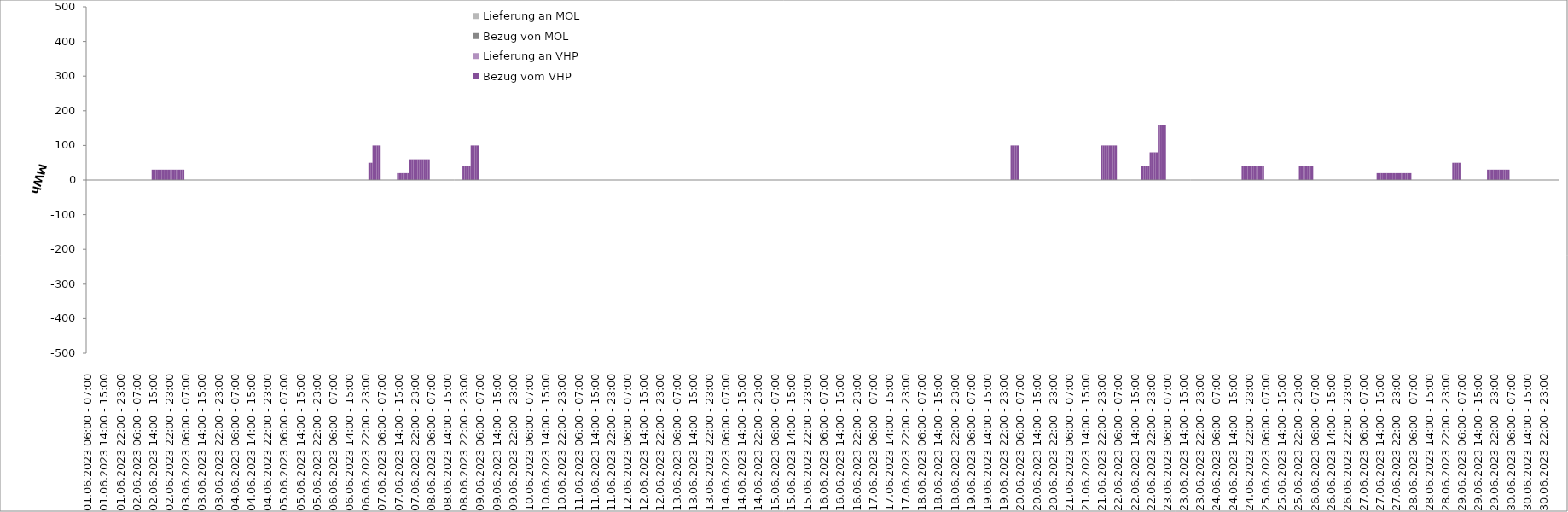
| Category | Bezug vom VHP | Lieferung an VHP | Bezug von MOL | Lieferung an MOL |
|---|---|---|---|---|
| 01.06.2023 06:00 - 07:00 | 0 | 0 | 0 | 0 |
| 01.06.2023 07:00 - 08:00 | 0 | 0 | 0 | 0 |
| 01.06.2023 08:00 - 09:00 | 0 | 0 | 0 | 0 |
| 01.06.2023 09:00 - 10:00 | 0 | 0 | 0 | 0 |
| 01.06.2023 10:00 - 11:00 | 0 | 0 | 0 | 0 |
| 01.06.2023 11:00 - 12:00 | 0 | 0 | 0 | 0 |
| 01.06.2023 12:00 - 13:00 | 0 | 0 | 0 | 0 |
| 01.06.2023 13:00 - 14:00 | 0 | 0 | 0 | 0 |
| 01.06.2023 14:00 - 15:00 | 0 | 0 | 0 | 0 |
| 01.06.2023 15:00 - 16:00 | 0 | 0 | 0 | 0 |
| 01.06.2023 16:00 - 17:00 | 0 | 0 | 0 | 0 |
| 01.06.2023 17:00 - 18:00 | 0 | 0 | 0 | 0 |
| 01.06.2023 18:00 - 19:00 | 0 | 0 | 0 | 0 |
| 01.06.2023 19:00 - 20:00 | 0 | 0 | 0 | 0 |
| 01.06.2023 20:00 - 21:00 | 0 | 0 | 0 | 0 |
| 01.06.2023 21:00 - 22:00 | 0 | 0 | 0 | 0 |
| 01.06.2023 22:00 - 23:00 | 0 | 0 | 0 | 0 |
| 01.06.2023 23:00 - 24:00 | 0 | 0 | 0 | 0 |
| 02.06.2023 00:00 - 01:00 | 0 | 0 | 0 | 0 |
| 02.06.2023 01:00 - 02:00 | 0 | 0 | 0 | 0 |
| 02.06.2023 02:00 - 03:00 | 0 | 0 | 0 | 0 |
| 02.06.2023 03:00 - 04:00 | 0 | 0 | 0 | 0 |
| 02.06.2023 04:00 - 05:00 | 0 | 0 | 0 | 0 |
| 02.06.2023 05:00 - 06:00 | 0 | 0 | 0 | 0 |
| 02.06.2023 06:00 - 07:00 | 0 | 0 | 0 | 0 |
| 02.06.2023 07:00 - 08:00 | 0 | 0 | 0 | 0 |
| 02.06.2023 08:00 - 09:00 | 0 | 0 | 0 | 0 |
| 02.06.2023 09:00 - 10:00 | 0 | 0 | 0 | 0 |
| 02.06.2023 10:00 - 11:00 | 0 | 0 | 0 | 0 |
| 02.06.2023 11:00 - 12:00 | 0 | 0 | 0 | 0 |
| 02.06.2023 12:00 - 13:00 | 0 | 0 | 0 | 0 |
| 02.06.2023 13:00 - 14:00 | 0 | 0 | 0 | 0 |
| 02.06.2023 14:00 - 15:00 | 30 | 0 | 0 | 0 |
| 02.06.2023 15:00 - 16:00 | 30 | 0 | 0 | 0 |
| 02.06.2023 16:00 - 17:00 | 30 | 0 | 0 | 0 |
| 02.06.2023 17:00 - 18:00 | 30 | 0 | 0 | 0 |
| 02.06.2023 18:00 - 19:00 | 30 | 0 | 0 | 0 |
| 02.06.2023 19:00 - 20:00 | 30 | 0 | 0 | 0 |
| 02.06.2023 20:00 - 21:00 | 30 | 0 | 0 | 0 |
| 02.06.2023 21:00 - 22:00 | 30 | 0 | 0 | 0 |
| 02.06.2023 22:00 - 23:00 | 30 | 0 | 0 | 0 |
| 02.06.2023 23:00 - 24:00 | 30 | 0 | 0 | 0 |
| 03.06.2023 00:00 - 01:00 | 30 | 0 | 0 | 0 |
| 03.06.2023 01:00 - 02:00 | 30 | 0 | 0 | 0 |
| 03.06.2023 02:00 - 03:00 | 30 | 0 | 0 | 0 |
| 03.06.2023 03:00 - 04:00 | 30 | 0 | 0 | 0 |
| 03.06.2023 04:00 - 05:00 | 30 | 0 | 0 | 0 |
| 03.06.2023 05:00 - 06:00 | 30 | 0 | 0 | 0 |
| 03.06.2023 06:00 - 07:00 | 0 | 0 | 0 | 0 |
| 03.06.2023 07:00 - 08:00 | 0 | 0 | 0 | 0 |
| 03.06.2023 08:00 - 09:00 | 0 | 0 | 0 | 0 |
| 03.06.2023 09:00 - 10:00 | 0 | 0 | 0 | 0 |
| 03.06.2023 10:00 - 11:00 | 0 | 0 | 0 | 0 |
| 03.06.2023 11:00 - 12:00 | 0 | 0 | 0 | 0 |
| 03.06.2023 12:00 - 13:00 | 0 | 0 | 0 | 0 |
| 03.06.2023 13:00 - 14:00 | 0 | 0 | 0 | 0 |
| 03.06.2023 14:00 - 15:00 | 0 | 0 | 0 | 0 |
| 03.06.2023 15:00 - 16:00 | 0 | 0 | 0 | 0 |
| 03.06.2023 16:00 - 17:00 | 0 | 0 | 0 | 0 |
| 03.06.2023 17:00 - 18:00 | 0 | 0 | 0 | 0 |
| 03.06.2023 18:00 - 19:00 | 0 | 0 | 0 | 0 |
| 03.06.2023 19:00 - 20:00 | 0 | 0 | 0 | 0 |
| 03.06.2023 20:00 - 21:00 | 0 | 0 | 0 | 0 |
| 03.06.2023 21:00 - 22:00 | 0 | 0 | 0 | 0 |
| 03.06.2023 22:00 - 23:00 | 0 | 0 | 0 | 0 |
| 03.06.2023 23:00 - 24:00 | 0 | 0 | 0 | 0 |
| 04.06.2023 00:00 - 01:00 | 0 | 0 | 0 | 0 |
| 04.06.2023 01:00 - 02:00 | 0 | 0 | 0 | 0 |
| 04.06.2023 02:00 - 03:00 | 0 | 0 | 0 | 0 |
| 04.06.2023 03:00 - 04:00 | 0 | 0 | 0 | 0 |
| 04.06.2023 04:00 - 05:00 | 0 | 0 | 0 | 0 |
| 04.06.2023 05:00 - 06:00 | 0 | 0 | 0 | 0 |
| 04.06.2023 06:00 - 07:00 | 0 | 0 | 0 | 0 |
| 04.06.2023 07:00 - 08:00 | 0 | 0 | 0 | 0 |
| 04.06.2023 08:00 - 09:00 | 0 | 0 | 0 | 0 |
| 04.06.2023 09:00 - 10:00 | 0 | 0 | 0 | 0 |
| 04.06.2023 10:00 - 11:00 | 0 | 0 | 0 | 0 |
| 04.06.2023 11:00 - 12:00 | 0 | 0 | 0 | 0 |
| 04.06.2023 12:00 - 13:00 | 0 | 0 | 0 | 0 |
| 04.06.2023 13:00 - 14:00 | 0 | 0 | 0 | 0 |
| 04.06.2023 14:00 - 15:00 | 0 | 0 | 0 | 0 |
| 04.06.2023 15:00 - 16:00 | 0 | 0 | 0 | 0 |
| 04.06.2023 16:00 - 17:00 | 0 | 0 | 0 | 0 |
| 04.06.2023 17:00 - 18:00 | 0 | 0 | 0 | 0 |
| 04.06.2023 18:00 - 19:00 | 0 | 0 | 0 | 0 |
| 04.06.2023 19:00 - 20:00 | 0 | 0 | 0 | 0 |
| 04.06.2023 20:00 - 21:00 | 0 | 0 | 0 | 0 |
| 04.06.2023 21:00 - 22:00 | 0 | 0 | 0 | 0 |
| 04.06.2023 22:00 - 23:00 | 0 | 0 | 0 | 0 |
| 04.06.2023 23:00 - 24:00 | 0 | 0 | 0 | 0 |
| 05.06.2023 00:00 - 01:00 | 0 | 0 | 0 | 0 |
| 05.06.2023 01:00 - 02:00 | 0 | 0 | 0 | 0 |
| 05.06.2023 02:00 - 03:00 | 0 | 0 | 0 | 0 |
| 05.06.2023 03:00 - 04:00 | 0 | 0 | 0 | 0 |
| 05.06.2023 04:00 - 05:00 | 0 | 0 | 0 | 0 |
| 05.06.2023 05:00 - 06:00 | 0 | 0 | 0 | 0 |
| 05.06.2023 06:00 - 07:00 | 0 | 0 | 0 | 0 |
| 05.06.2023 07:00 - 08:00 | 0 | 0 | 0 | 0 |
| 05.06.2023 08:00 - 09:00 | 0 | 0 | 0 | 0 |
| 05.06.2023 09:00 - 10:00 | 0 | 0 | 0 | 0 |
| 05.06.2023 10:00 - 11:00 | 0 | 0 | 0 | 0 |
| 05.06.2023 11:00 - 12:00 | 0 | 0 | 0 | 0 |
| 05.06.2023 12:00 - 13:00 | 0 | 0 | 0 | 0 |
| 05.06.2023 13:00 - 14:00 | 0 | 0 | 0 | 0 |
| 05.06.2023 14:00 - 15:00 | 0 | 0 | 0 | 0 |
| 05.06.2023 15:00 - 16:00 | 0 | 0 | 0 | 0 |
| 05.06.2023 16:00 - 17:00 | 0 | 0 | 0 | 0 |
| 05.06.2023 17:00 - 18:00 | 0 | 0 | 0 | 0 |
| 05.06.2023 18:00 - 19:00 | 0 | 0 | 0 | 0 |
| 05.06.2023 19:00 - 20:00 | 0 | 0 | 0 | 0 |
| 05.06.2023 20:00 - 21:00 | 0 | 0 | 0 | 0 |
| 05.06.2023 21:00 - 22:00 | 0 | 0 | 0 | 0 |
| 05.06.2023 22:00 - 23:00 | 0 | 0 | 0 | 0 |
| 05.06.2023 23:00 - 24:00 | 0 | 0 | 0 | 0 |
| 06.06.2023 00:00 - 01:00 | 0 | 0 | 0 | 0 |
| 06.06.2023 01:00 - 02:00 | 0 | 0 | 0 | 0 |
| 06.06.2023 02:00 - 03:00 | 0 | 0 | 0 | 0 |
| 06.06.2023 03:00 - 04:00 | 0 | 0 | 0 | 0 |
| 06.06.2023 04:00 - 05:00 | 0 | 0 | 0 | 0 |
| 06.06.2023 05:00 - 06:00 | 0 | 0 | 0 | 0 |
| 06.06.2023 06:00 - 07:00 | 0 | 0 | 0 | 0 |
| 06.06.2023 07:00 - 08:00 | 0 | 0 | 0 | 0 |
| 06.06.2023 08:00 - 09:00 | 0 | 0 | 0 | 0 |
| 06.06.2023 09:00 - 10:00 | 0 | 0 | 0 | 0 |
| 06.06.2023 10:00 - 11:00 | 0 | 0 | 0 | 0 |
| 06.06.2023 11:00 - 12:00 | 0 | 0 | 0 | 0 |
| 06.06.2023 12:00 - 13:00 | 0 | 0 | 0 | 0 |
| 06.06.2023 13:00 - 14:00 | 0 | 0 | 0 | 0 |
| 06.06.2023 14:00 - 15:00 | 0 | 0 | 0 | 0 |
| 06.06.2023 15:00 - 16:00 | 0 | 0 | 0 | 0 |
| 06.06.2023 16:00 - 17:00 | 0 | 0 | 0 | 0 |
| 06.06.2023 17:00 - 18:00 | 0 | 0 | 0 | 0 |
| 06.06.2023 18:00 - 19:00 | 0 | 0 | 0 | 0 |
| 06.06.2023 19:00 - 20:00 | 0 | 0 | 0 | 0 |
| 06.06.2023 20:00 - 21:00 | 0 | 0 | 0 | 0 |
| 06.06.2023 21:00 - 22:00 | 0 | 0 | 0 | 0 |
| 06.06.2023 22:00 - 23:00 | 0 | 0 | 0 | 0 |
| 06.06.2023 23:00 - 24:00 | 0 | 0 | 0 | 0 |
| 07.06.2023 00:00 - 01:00 | 50 | 0 | 0 | 0 |
| 07.06.2023 01:00 - 02:00 | 50 | 0 | 0 | 0 |
| 07.06.2023 02:00 - 03:00 | 100 | 0 | 0 | 0 |
| 07.06.2023 03:00 - 04:00 | 100 | 0 | 0 | 0 |
| 07.06.2023 04:00 - 05:00 | 100 | 0 | 0 | 0 |
| 07.06.2023 05:00 - 06:00 | 100 | 0 | 0 | 0 |
| 07.06.2023 06:00 - 07:00 | 0 | 0 | 0 | 0 |
| 07.06.2023 07:00 - 08:00 | 0 | 0 | 0 | 0 |
| 07.06.2023 08:00 - 09:00 | 0 | 0 | 0 | 0 |
| 07.06.2023 09:00 - 10:00 | 0 | 0 | 0 | 0 |
| 07.06.2023 10:00 - 11:00 | 0 | 0 | 0 | 0 |
| 07.06.2023 11:00 - 12:00 | 0 | 0 | 0 | 0 |
| 07.06.2023 12:00 - 13:00 | 0 | 0 | 0 | 0 |
| 07.06.2023 13:00 - 14:00 | 0 | 0 | 0 | 0 |
| 07.06.2023 14:00 - 15:00 | 20 | 0 | 0 | 0 |
| 07.06.2023 15:00 - 16:00 | 20 | 0 | 0 | 0 |
| 07.06.2023 16:00 - 17:00 | 20 | 0 | 0 | 0 |
| 07.06.2023 17:00 - 18:00 | 20 | 0 | 0 | 0 |
| 07.06.2023 18:00 - 19:00 | 20 | 0 | 0 | 0 |
| 07.06.2023 19:00 - 20:00 | 20 | 0 | 0 | 0 |
| 07.06.2023 20:00 - 21:00 | 60 | 0 | 0 | 0 |
| 07.06.2023 21:00 - 22:00 | 60 | 0 | 0 | 0 |
| 07.06.2023 22:00 - 23:00 | 60 | 0 | 0 | 0 |
| 07.06.2023 23:00 - 24:00 | 60 | 0 | 0 | 0 |
| 08.06.2023 00:00 - 01:00 | 60 | 0 | 0 | 0 |
| 08.06.2023 01:00 - 02:00 | 60 | 0 | 0 | 0 |
| 08.06.2023 02:00 - 03:00 | 60 | 0 | 0 | 0 |
| 08.06.2023 03:00 - 04:00 | 60 | 0 | 0 | 0 |
| 08.06.2023 04:00 - 05:00 | 60 | 0 | 0 | 0 |
| 08.06.2023 05:00 - 06:00 | 60 | 0 | 0 | 0 |
| 08.06.2023 06:00 - 07:00 | 0 | 0 | 0 | 0 |
| 08.06.2023 07:00 - 08:00 | 0 | 0 | 0 | 0 |
| 08.06.2023 08:00 - 09:00 | 0 | 0 | 0 | 0 |
| 08.06.2023 09:00 - 10:00 | 0 | 0 | 0 | 0 |
| 08.06.2023 10:00 - 11:00 | 0 | 0 | 0 | 0 |
| 08.06.2023 11:00 - 12:00 | 0 | 0 | 0 | 0 |
| 08.06.2023 12:00 - 13:00 | 0 | 0 | 0 | 0 |
| 08.06.2023 13:00 - 14:00 | 0 | 0 | 0 | 0 |
| 08.06.2023 14:00 - 15:00 | 0 | 0 | 0 | 0 |
| 08.06.2023 15:00 - 16:00 | 0 | 0 | 0 | 0 |
| 08.06.2023 16:00 - 17:00 | 0 | 0 | 0 | 0 |
| 08.06.2023 17:00 - 18:00 | 0 | 0 | 0 | 0 |
| 08.06.2023 18:00 - 19:00 | 0 | 0 | 0 | 0 |
| 08.06.2023 19:00 - 20:00 | 0 | 0 | 0 | 0 |
| 08.06.2023 20:00 - 21:00 | 0 | 0 | 0 | 0 |
| 08.06.2023 21:00 - 22:00 | 0 | 0 | 0 | 0 |
| 08.06.2023 22:00 - 23:00 | 40 | 0 | 0 | 0 |
| 08.06.2023 23:00 - 24:00 | 40 | 0 | 0 | 0 |
| 09.06.2023 00:00 - 01:00 | 40 | 0 | 0 | 0 |
| 09.06.2023 01:00 - 02:00 | 40 | 0 | 0 | 0 |
| 09.06.2023 02:00 - 03:00 | 100 | 0 | 0 | 0 |
| 09.06.2023 03:00 - 04:00 | 100 | 0 | 0 | 0 |
| 09.06.2023 04:00 - 05:00 | 100 | 0 | 0 | 0 |
| 09.06.2023 05:00 - 06:00 | 100 | 0 | 0 | 0 |
| 09.06.2023 06:00 - 07:00 | 0 | 0 | 0 | 0 |
| 09.06.2023 07:00 - 08:00 | 0 | 0 | 0 | 0 |
| 09.06.2023 08:00 - 09:00 | 0 | 0 | 0 | 0 |
| 09.06.2023 09:00 - 10:00 | 0 | 0 | 0 | 0 |
| 09.06.2023 10:00 - 11:00 | 0 | 0 | 0 | 0 |
| 09.06.2023 11:00 - 12:00 | 0 | 0 | 0 | 0 |
| 09.06.2023 12:00 - 13:00 | 0 | 0 | 0 | 0 |
| 09.06.2023 13:00 - 14:00 | 0 | 0 | 0 | 0 |
| 09.06.2023 14:00 - 15:00 | 0 | 0 | 0 | 0 |
| 09.06.2023 15:00 - 16:00 | 0 | 0 | 0 | 0 |
| 09.06.2023 16:00 - 17:00 | 0 | 0 | 0 | 0 |
| 09.06.2023 17:00 - 18:00 | 0 | 0 | 0 | 0 |
| 09.06.2023 18:00 - 19:00 | 0 | 0 | 0 | 0 |
| 09.06.2023 19:00 - 20:00 | 0 | 0 | 0 | 0 |
| 09.06.2023 20:00 - 21:00 | 0 | 0 | 0 | 0 |
| 09.06.2023 21:00 - 22:00 | 0 | 0 | 0 | 0 |
| 09.06.2023 22:00 - 23:00 | 0 | 0 | 0 | 0 |
| 09.06.2023 23:00 - 24:00 | 0 | 0 | 0 | 0 |
| 10.06.2023 00:00 - 01:00 | 0 | 0 | 0 | 0 |
| 10.06.2023 01:00 - 02:00 | 0 | 0 | 0 | 0 |
| 10.06.2023 02:00 - 03:00 | 0 | 0 | 0 | 0 |
| 10.06.2023 03:00 - 04:00 | 0 | 0 | 0 | 0 |
| 10.06.2023 04:00 - 05:00 | 0 | 0 | 0 | 0 |
| 10.06.2023 05:00 - 06:00 | 0 | 0 | 0 | 0 |
| 10.06.2023 06:00 - 07:00 | 0 | 0 | 0 | 0 |
| 10.06.2023 07:00 - 08:00 | 0 | 0 | 0 | 0 |
| 10.06.2023 08:00 - 09:00 | 0 | 0 | 0 | 0 |
| 10.06.2023 09:00 - 10:00 | 0 | 0 | 0 | 0 |
| 10.06.2023 10:00 - 11:00 | 0 | 0 | 0 | 0 |
| 10.06.2023 11:00 - 12:00 | 0 | 0 | 0 | 0 |
| 10.06.2023 12:00 - 13:00 | 0 | 0 | 0 | 0 |
| 10.06.2023 13:00 - 14:00 | 0 | 0 | 0 | 0 |
| 10.06.2023 14:00 - 15:00 | 0 | 0 | 0 | 0 |
| 10.06.2023 15:00 - 16:00 | 0 | 0 | 0 | 0 |
| 10.06.2023 16:00 - 17:00 | 0 | 0 | 0 | 0 |
| 10.06.2023 17:00 - 18:00 | 0 | 0 | 0 | 0 |
| 10.06.2023 18:00 - 19:00 | 0 | 0 | 0 | 0 |
| 10.06.2023 19:00 - 20:00 | 0 | 0 | 0 | 0 |
| 10.06.2023 20:00 - 21:00 | 0 | 0 | 0 | 0 |
| 10.06.2023 21:00 - 22:00 | 0 | 0 | 0 | 0 |
| 10.06.2023 22:00 - 23:00 | 0 | 0 | 0 | 0 |
| 10.06.2023 23:00 - 24:00 | 0 | 0 | 0 | 0 |
| 11.06.2023 00:00 - 01:00 | 0 | 0 | 0 | 0 |
| 11.06.2023 01:00 - 02:00 | 0 | 0 | 0 | 0 |
| 11.06.2023 02:00 - 03:00 | 0 | 0 | 0 | 0 |
| 11.06.2023 03:00 - 04:00 | 0 | 0 | 0 | 0 |
| 11.06.2023 04:00 - 05:00 | 0 | 0 | 0 | 0 |
| 11.06.2023 05:00 - 06:00 | 0 | 0 | 0 | 0 |
| 11.06.2023 06:00 - 07:00 | 0 | 0 | 0 | 0 |
| 11.06.2023 07:00 - 08:00 | 0 | 0 | 0 | 0 |
| 11.06.2023 08:00 - 09:00 | 0 | 0 | 0 | 0 |
| 11.06.2023 09:00 - 10:00 | 0 | 0 | 0 | 0 |
| 11.06.2023 10:00 - 11:00 | 0 | 0 | 0 | 0 |
| 11.06.2023 11:00 - 12:00 | 0 | 0 | 0 | 0 |
| 11.06.2023 12:00 - 13:00 | 0 | 0 | 0 | 0 |
| 11.06.2023 13:00 - 14:00 | 0 | 0 | 0 | 0 |
| 11.06.2023 14:00 - 15:00 | 0 | 0 | 0 | 0 |
| 11.06.2023 15:00 - 16:00 | 0 | 0 | 0 | 0 |
| 11.06.2023 16:00 - 17:00 | 0 | 0 | 0 | 0 |
| 11.06.2023 17:00 - 18:00 | 0 | 0 | 0 | 0 |
| 11.06.2023 18:00 - 19:00 | 0 | 0 | 0 | 0 |
| 11.06.2023 19:00 - 20:00 | 0 | 0 | 0 | 0 |
| 11.06.2023 20:00 - 21:00 | 0 | 0 | 0 | 0 |
| 11.06.2023 21:00 - 22:00 | 0 | 0 | 0 | 0 |
| 11.06.2023 22:00 - 23:00 | 0 | 0 | 0 | 0 |
| 11.06.2023 23:00 - 24:00 | 0 | 0 | 0 | 0 |
| 12.06.2023 00:00 - 01:00 | 0 | 0 | 0 | 0 |
| 12.06.2023 01:00 - 02:00 | 0 | 0 | 0 | 0 |
| 12.06.2023 02:00 - 03:00 | 0 | 0 | 0 | 0 |
| 12.06.2023 03:00 - 04:00 | 0 | 0 | 0 | 0 |
| 12.06.2023 04:00 - 05:00 | 0 | 0 | 0 | 0 |
| 12.06.2023 05:00 - 06:00 | 0 | 0 | 0 | 0 |
| 12.06.2023 06:00 - 07:00 | 0 | 0 | 0 | 0 |
| 12.06.2023 07:00 - 08:00 | 0 | 0 | 0 | 0 |
| 12.06.2023 08:00 - 09:00 | 0 | 0 | 0 | 0 |
| 12.06.2023 09:00 - 10:00 | 0 | 0 | 0 | 0 |
| 12.06.2023 10:00 - 11:00 | 0 | 0 | 0 | 0 |
| 12.06.2023 11:00 - 12:00 | 0 | 0 | 0 | 0 |
| 12.06.2023 12:00 - 13:00 | 0 | 0 | 0 | 0 |
| 12.06.2023 13:00 - 14:00 | 0 | 0 | 0 | 0 |
| 12.06.2023 14:00 - 15:00 | 0 | 0 | 0 | 0 |
| 12.06.2023 15:00 - 16:00 | 0 | 0 | 0 | 0 |
| 12.06.2023 16:00 - 17:00 | 0 | 0 | 0 | 0 |
| 12.06.2023 17:00 - 18:00 | 0 | 0 | 0 | 0 |
| 12.06.2023 18:00 - 19:00 | 0 | 0 | 0 | 0 |
| 12.06.2023 19:00 - 20:00 | 0 | 0 | 0 | 0 |
| 12.06.2023 20:00 - 21:00 | 0 | 0 | 0 | 0 |
| 12.06.2023 21:00 - 22:00 | 0 | 0 | 0 | 0 |
| 12.06.2023 22:00 - 23:00 | 0 | 0 | 0 | 0 |
| 12.06.2023 23:00 - 24:00 | 0 | 0 | 0 | 0 |
| 13.06.2023 00:00 - 01:00 | 0 | 0 | 0 | 0 |
| 13.06.2023 01:00 - 02:00 | 0 | 0 | 0 | 0 |
| 13.06.2023 02:00 - 03:00 | 0 | 0 | 0 | 0 |
| 13.06.2023 03:00 - 04:00 | 0 | 0 | 0 | 0 |
| 13.06.2023 04:00 - 05:00 | 0 | 0 | 0 | 0 |
| 13.06.2023 05:00 - 06:00 | 0 | 0 | 0 | 0 |
| 13.06.2023 06:00 - 07:00 | 0 | 0 | 0 | 0 |
| 13.06.2023 07:00 - 08:00 | 0 | 0 | 0 | 0 |
| 13.06.2023 08:00 - 09:00 | 0 | 0 | 0 | 0 |
| 13.06.2023 09:00 - 10:00 | 0 | 0 | 0 | 0 |
| 13.06.2023 10:00 - 11:00 | 0 | 0 | 0 | 0 |
| 13.06.2023 11:00 - 12:00 | 0 | 0 | 0 | 0 |
| 13.06.2023 12:00 - 13:00 | 0 | 0 | 0 | 0 |
| 13.06.2023 13:00 - 14:00 | 0 | 0 | 0 | 0 |
| 13.06.2023 14:00 - 15:00 | 0 | 0 | 0 | 0 |
| 13.06.2023 15:00 - 16:00 | 0 | 0 | 0 | 0 |
| 13.06.2023 16:00 - 17:00 | 0 | 0 | 0 | 0 |
| 13.06.2023 17:00 - 18:00 | 0 | 0 | 0 | 0 |
| 13.06.2023 18:00 - 19:00 | 0 | 0 | 0 | 0 |
| 13.06.2023 19:00 - 20:00 | 0 | 0 | 0 | 0 |
| 13.06.2023 20:00 - 21:00 | 0 | 0 | 0 | 0 |
| 13.06.2023 21:00 - 22:00 | 0 | 0 | 0 | 0 |
| 13.06.2023 22:00 - 23:00 | 0 | 0 | 0 | 0 |
| 13.06.2023 23:00 - 24:00 | 0 | 0 | 0 | 0 |
| 14.06.2023 00:00 - 01:00 | 0 | 0 | 0 | 0 |
| 14.06.2023 01:00 - 02:00 | 0 | 0 | 0 | 0 |
| 14.06.2023 02:00 - 03:00 | 0 | 0 | 0 | 0 |
| 14.06.2023 03:00 - 04:00 | 0 | 0 | 0 | 0 |
| 14.06.2023 04:00 - 05:00 | 0 | 0 | 0 | 0 |
| 14.06.2023 05:00 - 06:00 | 0 | 0 | 0 | 0 |
| 14.06.2023 06:00 - 07:00 | 0 | 0 | 0 | 0 |
| 14.06.2023 07:00 - 08:00 | 0 | 0 | 0 | 0 |
| 14.06.2023 08:00 - 09:00 | 0 | 0 | 0 | 0 |
| 14.06.2023 09:00 - 10:00 | 0 | 0 | 0 | 0 |
| 14.06.2023 10:00 - 11:00 | 0 | 0 | 0 | 0 |
| 14.06.2023 11:00 - 12:00 | 0 | 0 | 0 | 0 |
| 14.06.2023 12:00 - 13:00 | 0 | 0 | 0 | 0 |
| 14.06.2023 13:00 - 14:00 | 0 | 0 | 0 | 0 |
| 14.06.2023 14:00 - 15:00 | 0 | 0 | 0 | 0 |
| 14.06.2023 15:00 - 16:00 | 0 | 0 | 0 | 0 |
| 14.06.2023 16:00 - 17:00 | 0 | 0 | 0 | 0 |
| 14.06.2023 17:00 - 18:00 | 0 | 0 | 0 | 0 |
| 14.06.2023 18:00 - 19:00 | 0 | 0 | 0 | 0 |
| 14.06.2023 19:00 - 20:00 | 0 | 0 | 0 | 0 |
| 14.06.2023 20:00 - 21:00 | 0 | 0 | 0 | 0 |
| 14.06.2023 21:00 - 22:00 | 0 | 0 | 0 | 0 |
| 14.06.2023 22:00 - 23:00 | 0 | 0 | 0 | 0 |
| 14.06.2023 23:00 - 24:00 | 0 | 0 | 0 | 0 |
| 15.06.2023 00:00 - 01:00 | 0 | 0 | 0 | 0 |
| 15.06.2023 01:00 - 02:00 | 0 | 0 | 0 | 0 |
| 15.06.2023 02:00 - 03:00 | 0 | 0 | 0 | 0 |
| 15.06.2023 03:00 - 04:00 | 0 | 0 | 0 | 0 |
| 15.06.2023 04:00 - 05:00 | 0 | 0 | 0 | 0 |
| 15.06.2023 05:00 - 06:00 | 0 | 0 | 0 | 0 |
| 15.06.2023 06:00 - 07:00 | 0 | 0 | 0 | 0 |
| 15.06.2023 07:00 - 08:00 | 0 | 0 | 0 | 0 |
| 15.06.2023 08:00 - 09:00 | 0 | 0 | 0 | 0 |
| 15.06.2023 09:00 - 10:00 | 0 | 0 | 0 | 0 |
| 15.06.2023 10:00 - 11:00 | 0 | 0 | 0 | 0 |
| 15.06.2023 11:00 - 12:00 | 0 | 0 | 0 | 0 |
| 15.06.2023 12:00 - 13:00 | 0 | 0 | 0 | 0 |
| 15.06.2023 13:00 - 14:00 | 0 | 0 | 0 | 0 |
| 15.06.2023 14:00 - 15:00 | 0 | 0 | 0 | 0 |
| 15.06.2023 15:00 - 16:00 | 0 | 0 | 0 | 0 |
| 15.06.2023 16:00 - 17:00 | 0 | 0 | 0 | 0 |
| 15.06.2023 17:00 - 18:00 | 0 | 0 | 0 | 0 |
| 15.06.2023 18:00 - 19:00 | 0 | 0 | 0 | 0 |
| 15.06.2023 19:00 - 20:00 | 0 | 0 | 0 | 0 |
| 15.06.2023 20:00 - 21:00 | 0 | 0 | 0 | 0 |
| 15.06.2023 21:00 - 22:00 | 0 | 0 | 0 | 0 |
| 15.06.2023 22:00 - 23:00 | 0 | 0 | 0 | 0 |
| 15.06.2023 23:00 - 24:00 | 0 | 0 | 0 | 0 |
| 16.06.2023 00:00 - 01:00 | 0 | 0 | 0 | 0 |
| 16.06.2023 01:00 - 02:00 | 0 | 0 | 0 | 0 |
| 16.06.2023 02:00 - 03:00 | 0 | 0 | 0 | 0 |
| 16.06.2023 03:00 - 04:00 | 0 | 0 | 0 | 0 |
| 16.06.2023 04:00 - 05:00 | 0 | 0 | 0 | 0 |
| 16.06.2023 05:00 - 06:00 | 0 | 0 | 0 | 0 |
| 16.06.2023 06:00 - 07:00 | 0 | 0 | 0 | 0 |
| 16.06.2023 07:00 - 08:00 | 0 | 0 | 0 | 0 |
| 16.06.2023 08:00 - 09:00 | 0 | 0 | 0 | 0 |
| 16.06.2023 09:00 - 10:00 | 0 | 0 | 0 | 0 |
| 16.06.2023 10:00 - 11:00 | 0 | 0 | 0 | 0 |
| 16.06.2023 11:00 - 12:00 | 0 | 0 | 0 | 0 |
| 16.06.2023 12:00 - 13:00 | 0 | 0 | 0 | 0 |
| 16.06.2023 13:00 - 14:00 | 0 | 0 | 0 | 0 |
| 16.06.2023 14:00 - 15:00 | 0 | 0 | 0 | 0 |
| 16.06.2023 15:00 - 16:00 | 0 | 0 | 0 | 0 |
| 16.06.2023 16:00 - 17:00 | 0 | 0 | 0 | 0 |
| 16.06.2023 17:00 - 18:00 | 0 | 0 | 0 | 0 |
| 16.06.2023 18:00 - 19:00 | 0 | 0 | 0 | 0 |
| 16.06.2023 19:00 - 20:00 | 0 | 0 | 0 | 0 |
| 16.06.2023 20:00 - 21:00 | 0 | 0 | 0 | 0 |
| 16.06.2023 21:00 - 22:00 | 0 | 0 | 0 | 0 |
| 16.06.2023 22:00 - 23:00 | 0 | 0 | 0 | 0 |
| 16.06.2023 23:00 - 24:00 | 0 | 0 | 0 | 0 |
| 17.06.2023 00:00 - 01:00 | 0 | 0 | 0 | 0 |
| 17.06.2023 01:00 - 02:00 | 0 | 0 | 0 | 0 |
| 17.06.2023 02:00 - 03:00 | 0 | 0 | 0 | 0 |
| 17.06.2023 03:00 - 04:00 | 0 | 0 | 0 | 0 |
| 17.06.2023 04:00 - 05:00 | 0 | 0 | 0 | 0 |
| 17.06.2023 05:00 - 06:00 | 0 | 0 | 0 | 0 |
| 17.06.2023 06:00 - 07:00 | 0 | 0 | 0 | 0 |
| 17.06.2023 07:00 - 08:00 | 0 | 0 | 0 | 0 |
| 17.06.2023 08:00 - 09:00 | 0 | 0 | 0 | 0 |
| 17.06.2023 09:00 - 10:00 | 0 | 0 | 0 | 0 |
| 17.06.2023 10:00 - 11:00 | 0 | 0 | 0 | 0 |
| 17.06.2023 11:00 - 12:00 | 0 | 0 | 0 | 0 |
| 17.06.2023 12:00 - 13:00 | 0 | 0 | 0 | 0 |
| 17.06.2023 13:00 - 14:00 | 0 | 0 | 0 | 0 |
| 17.06.2023 14:00 - 15:00 | 0 | 0 | 0 | 0 |
| 17.06.2023 15:00 - 16:00 | 0 | 0 | 0 | 0 |
| 17.06.2023 16:00 - 17:00 | 0 | 0 | 0 | 0 |
| 17.06.2023 17:00 - 18:00 | 0 | 0 | 0 | 0 |
| 17.06.2023 18:00 - 19:00 | 0 | 0 | 0 | 0 |
| 17.06.2023 19:00 - 20:00 | 0 | 0 | 0 | 0 |
| 17.06.2023 20:00 - 21:00 | 0 | 0 | 0 | 0 |
| 17.06.2023 21:00 - 22:00 | 0 | 0 | 0 | 0 |
| 17.06.2023 22:00 - 23:00 | 0 | 0 | 0 | 0 |
| 17.06.2023 23:00 - 24:00 | 0 | 0 | 0 | 0 |
| 18.06.2023 00:00 - 01:00 | 0 | 0 | 0 | 0 |
| 18.06.2023 01:00 - 02:00 | 0 | 0 | 0 | 0 |
| 18.06.2023 02:00 - 03:00 | 0 | 0 | 0 | 0 |
| 18.06.2023 03:00 - 04:00 | 0 | 0 | 0 | 0 |
| 18.06.2023 04:00 - 05:00 | 0 | 0 | 0 | 0 |
| 18.06.2023 05:00 - 06:00 | 0 | 0 | 0 | 0 |
| 18.06.2023 06:00 - 07:00 | 0 | 0 | 0 | 0 |
| 18.06.2023 07:00 - 08:00 | 0 | 0 | 0 | 0 |
| 18.06.2023 08:00 - 09:00 | 0 | 0 | 0 | 0 |
| 18.06.2023 09:00 - 10:00 | 0 | 0 | 0 | 0 |
| 18.06.2023 10:00 - 11:00 | 0 | 0 | 0 | 0 |
| 18.06.2023 11:00 - 12:00 | 0 | 0 | 0 | 0 |
| 18.06.2023 12:00 - 13:00 | 0 | 0 | 0 | 0 |
| 18.06.2023 13:00 - 14:00 | 0 | 0 | 0 | 0 |
| 18.06.2023 14:00 - 15:00 | 0 | 0 | 0 | 0 |
| 18.06.2023 15:00 - 16:00 | 0 | 0 | 0 | 0 |
| 18.06.2023 16:00 - 17:00 | 0 | 0 | 0 | 0 |
| 18.06.2023 17:00 - 18:00 | 0 | 0 | 0 | 0 |
| 18.06.2023 18:00 - 19:00 | 0 | 0 | 0 | 0 |
| 18.06.2023 19:00 - 20:00 | 0 | 0 | 0 | 0 |
| 18.06.2023 20:00 - 21:00 | 0 | 0 | 0 | 0 |
| 18.06.2023 21:00 - 22:00 | 0 | 0 | 0 | 0 |
| 18.06.2023 22:00 - 23:00 | 0 | 0 | 0 | 0 |
| 18.06.2023 23:00 - 24:00 | 0 | 0 | 0 | 0 |
| 19.06.2023 00:00 - 01:00 | 0 | 0 | 0 | 0 |
| 19.06.2023 01:00 - 02:00 | 0 | 0 | 0 | 0 |
| 19.06.2023 02:00 - 03:00 | 0 | 0 | 0 | 0 |
| 19.06.2023 03:00 - 04:00 | 0 | 0 | 0 | 0 |
| 19.06.2023 04:00 - 05:00 | 0 | 0 | 0 | 0 |
| 19.06.2023 05:00 - 06:00 | 0 | 0 | 0 | 0 |
| 19.06.2023 06:00 - 07:00 | 0 | 0 | 0 | 0 |
| 19.06.2023 07:00 - 08:00 | 0 | 0 | 0 | 0 |
| 19.06.2023 08:00 - 09:00 | 0 | 0 | 0 | 0 |
| 19.06.2023 09:00 - 10:00 | 0 | 0 | 0 | 0 |
| 19.06.2023 10:00 - 11:00 | 0 | 0 | 0 | 0 |
| 19.06.2023 11:00 - 12:00 | 0 | 0 | 0 | 0 |
| 19.06.2023 12:00 - 13:00 | 0 | 0 | 0 | 0 |
| 19.06.2023 13:00 - 14:00 | 0 | 0 | 0 | 0 |
| 19.06.2023 14:00 - 15:00 | 0 | 0 | 0 | 0 |
| 19.06.2023 15:00 - 16:00 | 0 | 0 | 0 | 0 |
| 19.06.2023 16:00 - 17:00 | 0 | 0 | 0 | 0 |
| 19.06.2023 17:00 - 18:00 | 0 | 0 | 0 | 0 |
| 19.06.2023 18:00 - 19:00 | 0 | 0 | 0 | 0 |
| 19.06.2023 19:00 - 20:00 | 0 | 0 | 0 | 0 |
| 19.06.2023 20:00 - 21:00 | 0 | 0 | 0 | 0 |
| 19.06.2023 21:00 - 22:00 | 0 | 0 | 0 | 0 |
| 19.06.2023 22:00 - 23:00 | 0 | 0 | 0 | 0 |
| 19.06.2023 23:00 - 24:00 | 0 | 0 | 0 | 0 |
| 20.06.2023 00:00 - 01:00 | 0 | 0 | 0 | 0 |
| 20.06.2023 01:00 - 02:00 | 0 | 0 | 0 | 0 |
| 20.06.2023 02:00 - 03:00 | 100 | 0 | 0 | 0 |
| 20.06.2023 03:00 - 04:00 | 100 | 0 | 0 | 0 |
| 20.06.2023 04:00 - 05:00 | 100 | 0 | 0 | 0 |
| 20.06.2023 05:00 - 06:00 | 100 | 0 | 0 | 0 |
| 20.06.2023 06:00 - 07:00 | 0 | 0 | 0 | 0 |
| 20.06.2023 07:00 - 08:00 | 0 | 0 | 0 | 0 |
| 20.06.2023 08:00 - 09:00 | 0 | 0 | 0 | 0 |
| 20.06.2023 09:00 - 10:00 | 0 | 0 | 0 | 0 |
| 20.06.2023 10:00 - 11:00 | 0 | 0 | 0 | 0 |
| 20.06.2023 11:00 - 12:00 | 0 | 0 | 0 | 0 |
| 20.06.2023 12:00 - 13:00 | 0 | 0 | 0 | 0 |
| 20.06.2023 13:00 - 14:00 | 0 | 0 | 0 | 0 |
| 20.06.2023 14:00 - 15:00 | 0 | 0 | 0 | 0 |
| 20.06.2023 15:00 - 16:00 | 0 | 0 | 0 | 0 |
| 20.06.2023 16:00 - 17:00 | 0 | 0 | 0 | 0 |
| 20.06.2023 17:00 - 18:00 | 0 | 0 | 0 | 0 |
| 20.06.2023 18:00 - 19:00 | 0 | 0 | 0 | 0 |
| 20.06.2023 19:00 - 20:00 | 0 | 0 | 0 | 0 |
| 20.06.2023 20:00 - 21:00 | 0 | 0 | 0 | 0 |
| 20.06.2023 21:00 - 22:00 | 0 | 0 | 0 | 0 |
| 20.06.2023 22:00 - 23:00 | 0 | 0 | 0 | 0 |
| 20.06.2023 23:00 - 24:00 | 0 | 0 | 0 | 0 |
| 21.06.2023 00:00 - 01:00 | 0 | 0 | 0 | 0 |
| 21.06.2023 01:00 - 02:00 | 0 | 0 | 0 | 0 |
| 21.06.2023 02:00 - 03:00 | 0 | 0 | 0 | 0 |
| 21.06.2023 03:00 - 04:00 | 0 | 0 | 0 | 0 |
| 21.06.2023 04:00 - 05:00 | 0 | 0 | 0 | 0 |
| 21.06.2023 05:00 - 06:00 | 0 | 0 | 0 | 0 |
| 21.06.2023 06:00 - 07:00 | 0 | 0 | 0 | 0 |
| 21.06.2023 07:00 - 08:00 | 0 | 0 | 0 | 0 |
| 21.06.2023 08:00 - 09:00 | 0 | 0 | 0 | 0 |
| 21.06.2023 09:00 - 10:00 | 0 | 0 | 0 | 0 |
| 21.06.2023 10:00 - 11:00 | 0 | 0 | 0 | 0 |
| 21.06.2023 11:00 - 12:00 | 0 | 0 | 0 | 0 |
| 21.06.2023 12:00 - 13:00 | 0 | 0 | 0 | 0 |
| 21.06.2023 13:00 - 14:00 | 0 | 0 | 0 | 0 |
| 21.06.2023 14:00 - 15:00 | 0 | 0 | 0 | 0 |
| 21.06.2023 15:00 - 16:00 | 0 | 0 | 0 | 0 |
| 21.06.2023 16:00 - 17:00 | 0 | 0 | 0 | 0 |
| 21.06.2023 17:00 - 18:00 | 0 | 0 | 0 | 0 |
| 21.06.2023 18:00 - 19:00 | 0 | 0 | 0 | 0 |
| 21.06.2023 19:00 - 20:00 | 0 | 0 | 0 | 0 |
| 21.06.2023 20:00 - 21:00 | 0 | 0 | 0 | 0 |
| 21.06.2023 21:00 - 22:00 | 0 | 0 | 0 | 0 |
| 21.06.2023 22:00 - 23:00 | 100 | 0 | 0 | 0 |
| 21.06.2023 23:00 - 24:00 | 100 | 0 | 0 | 0 |
| 22.06.2023 00:00 - 01:00 | 100 | 0 | 0 | 0 |
| 22.06.2023 01:00 - 02:00 | 100 | 0 | 0 | 0 |
| 22.06.2023 02:00 - 03:00 | 100 | 0 | 0 | 0 |
| 22.06.2023 03:00 - 04:00 | 100 | 0 | 0 | 0 |
| 22.06.2023 04:00 - 05:00 | 100 | 0 | 0 | 0 |
| 22.06.2023 05:00 - 06:00 | 100 | 0 | 0 | 0 |
| 22.06.2023 06:00 - 07:00 | 0 | 0 | 0 | 0 |
| 22.06.2023 07:00 - 08:00 | 0 | 0 | 0 | 0 |
| 22.06.2023 08:00 - 09:00 | 0 | 0 | 0 | 0 |
| 22.06.2023 09:00 - 10:00 | 0 | 0 | 0 | 0 |
| 22.06.2023 10:00 - 11:00 | 0 | 0 | 0 | 0 |
| 22.06.2023 11:00 - 12:00 | 0 | 0 | 0 | 0 |
| 22.06.2023 12:00 - 13:00 | 0 | 0 | 0 | 0 |
| 22.06.2023 13:00 - 14:00 | 0 | 0 | 0 | 0 |
| 22.06.2023 14:00 - 15:00 | 0 | 0 | 0 | 0 |
| 22.06.2023 15:00 - 16:00 | 0 | 0 | 0 | 0 |
| 22.06.2023 16:00 - 17:00 | 0 | 0 | 0 | 0 |
| 22.06.2023 17:00 - 18:00 | 0 | 0 | 0 | 0 |
| 22.06.2023 18:00 - 19:00 | 40 | 0 | 0 | 0 |
| 22.06.2023 19:00 - 20:00 | 40 | 0 | 0 | 0 |
| 22.06.2023 20:00 - 21:00 | 40 | 0 | 0 | 0 |
| 22.06.2023 21:00 - 22:00 | 40 | 0 | 0 | 0 |
| 22.06.2023 22:00 - 23:00 | 80 | 0 | 0 | 0 |
| 22.06.2023 23:00 - 24:00 | 80 | 0 | 0 | 0 |
| 23.06.2023 00:00 - 01:00 | 80 | 0 | 0 | 0 |
| 23.06.2023 01:00 - 02:00 | 80 | 0 | 0 | 0 |
| 23.06.2023 02:00 - 03:00 | 160 | 0 | 0 | 0 |
| 23.06.2023 03:00 - 04:00 | 160 | 0 | 0 | 0 |
| 23.06.2023 04:00 - 05:00 | 160 | 0 | 0 | 0 |
| 23.06.2023 05:00 - 06:00 | 160 | 0 | 0 | 0 |
| 23.06.2023 06:00 - 07:00 | 0 | 0 | 0 | 0 |
| 23.06.2023 07:00 - 08:00 | 0 | 0 | 0 | 0 |
| 23.06.2023 08:00 - 09:00 | 0 | 0 | 0 | 0 |
| 23.06.2023 09:00 - 10:00 | 0 | 0 | 0 | 0 |
| 23.06.2023 10:00 - 11:00 | 0 | 0 | 0 | 0 |
| 23.06.2023 11:00 - 12:00 | 0 | 0 | 0 | 0 |
| 23.06.2023 12:00 - 13:00 | 0 | 0 | 0 | 0 |
| 23.06.2023 13:00 - 14:00 | 0 | 0 | 0 | 0 |
| 23.06.2023 14:00 - 15:00 | 0 | 0 | 0 | 0 |
| 23.06.2023 15:00 - 16:00 | 0 | 0 | 0 | 0 |
| 23.06.2023 16:00 - 17:00 | 0 | 0 | 0 | 0 |
| 23.06.2023 17:00 - 18:00 | 0 | 0 | 0 | 0 |
| 23.06.2023 18:00 - 19:00 | 0 | 0 | 0 | 0 |
| 23.06.2023 19:00 - 20:00 | 0 | 0 | 0 | 0 |
| 23.06.2023 20:00 - 21:00 | 0 | 0 | 0 | 0 |
| 23.06.2023 21:00 - 22:00 | 0 | 0 | 0 | 0 |
| 23.06.2023 22:00 - 23:00 | 0 | 0 | 0 | 0 |
| 23.06.2023 23:00 - 24:00 | 0 | 0 | 0 | 0 |
| 24.06.2023 00:00 - 01:00 | 0 | 0 | 0 | 0 |
| 24.06.2023 01:00 - 02:00 | 0 | 0 | 0 | 0 |
| 24.06.2023 02:00 - 03:00 | 0 | 0 | 0 | 0 |
| 24.06.2023 03:00 - 04:00 | 0 | 0 | 0 | 0 |
| 24.06.2023 04:00 - 05:00 | 0 | 0 | 0 | 0 |
| 24.06.2023 05:00 - 06:00 | 0 | 0 | 0 | 0 |
| 24.06.2023 06:00 - 07:00 | 0 | 0 | 0 | 0 |
| 24.06.2023 07:00 - 08:00 | 0 | 0 | 0 | 0 |
| 24.06.2023 08:00 - 09:00 | 0 | 0 | 0 | 0 |
| 24.06.2023 09:00 - 10:00 | 0 | 0 | 0 | 0 |
| 24.06.2023 10:00 - 11:00 | 0 | 0 | 0 | 0 |
| 24.06.2023 11:00 - 12:00 | 0 | 0 | 0 | 0 |
| 24.06.2023 12:00 - 13:00 | 0 | 0 | 0 | 0 |
| 24.06.2023 13:00 - 14:00 | 0 | 0 | 0 | 0 |
| 24.06.2023 14:00 - 15:00 | 0 | 0 | 0 | 0 |
| 24.06.2023 15:00 - 16:00 | 0 | 0 | 0 | 0 |
| 24.06.2023 16:00 - 17:00 | 0 | 0 | 0 | 0 |
| 24.06.2023 17:00 - 18:00 | 0 | 0 | 0 | 0 |
| 24.06.2023 18:00 - 19:00 | 0 | 0 | 0 | 0 |
| 24.06.2023 19:00 - 20:00 | 40 | 0 | 0 | 0 |
| 24.06.2023 20:00 - 21:00 | 40 | 0 | 0 | 0 |
| 24.06.2023 21:00 - 22:00 | 40 | 0 | 0 | 0 |
| 24.06.2023 22:00 - 23:00 | 40 | 0 | 0 | 0 |
| 24.06.2023 23:00 - 24:00 | 40 | 0 | 0 | 0 |
| 25.06.2023 00:00 - 01:00 | 40 | 0 | 0 | 0 |
| 25.06.2023 01:00 - 02:00 | 40 | 0 | 0 | 0 |
| 25.06.2023 02:00 - 03:00 | 40 | 0 | 0 | 0 |
| 25.06.2023 03:00 - 04:00 | 40 | 0 | 0 | 0 |
| 25.06.2023 04:00 - 05:00 | 40 | 0 | 0 | 0 |
| 25.06.2023 05:00 - 06:00 | 40 | 0 | 0 | 0 |
| 25.06.2023 06:00 - 07:00 | 0 | 0 | 0 | 0 |
| 25.06.2023 07:00 - 08:00 | 0 | 0 | 0 | 0 |
| 25.06.2023 08:00 - 09:00 | 0 | 0 | 0 | 0 |
| 25.06.2023 09:00 - 10:00 | 0 | 0 | 0 | 0 |
| 25.06.2023 10:00 - 11:00 | 0 | 0 | 0 | 0 |
| 25.06.2023 11:00 - 12:00 | 0 | 0 | 0 | 0 |
| 25.06.2023 12:00 - 13:00 | 0 | 0 | 0 | 0 |
| 25.06.2023 13:00 - 14:00 | 0 | 0 | 0 | 0 |
| 25.06.2023 14:00 - 15:00 | 0 | 0 | 0 | 0 |
| 25.06.2023 15:00 - 16:00 | 0 | 0 | 0 | 0 |
| 25.06.2023 16:00 - 17:00 | 0 | 0 | 0 | 0 |
| 25.06.2023 17:00 - 18:00 | 0 | 0 | 0 | 0 |
| 25.06.2023 18:00 - 19:00 | 0 | 0 | 0 | 0 |
| 25.06.2023 19:00 - 20:00 | 0 | 0 | 0 | 0 |
| 25.06.2023 20:00 - 21:00 | 0 | 0 | 0 | 0 |
| 25.06.2023 21:00 - 22:00 | 0 | 0 | 0 | 0 |
| 25.06.2023 22:00 - 23:00 | 0 | 0 | 0 | 0 |
| 25.06.2023 23:00 - 24:00 | 40 | 0 | 0 | 0 |
| 26.06.2023 00:00 - 01:00 | 40 | 0 | 0 | 0 |
| 26.06.2023 01:00 - 02:00 | 40 | 0 | 0 | 0 |
| 26.06.2023 02:00 - 03:00 | 40 | 0 | 0 | 0 |
| 26.06.2023 03:00 - 04:00 | 40 | 0 | 0 | 0 |
| 26.06.2023 04:00 - 05:00 | 40 | 0 | 0 | 0 |
| 26.06.2023 05:00 - 06:00 | 40 | 0 | 0 | 0 |
| 26.06.2023 06:00 - 07:00 | 0 | 0 | 0 | 0 |
| 26.06.2023 07:00 - 08:00 | 0 | 0 | 0 | 0 |
| 26.06.2023 08:00 - 09:00 | 0 | 0 | 0 | 0 |
| 26.06.2023 09:00 - 10:00 | 0 | 0 | 0 | 0 |
| 26.06.2023 10:00 - 11:00 | 0 | 0 | 0 | 0 |
| 26.06.2023 11:00 - 12:00 | 0 | 0 | 0 | 0 |
| 26.06.2023 12:00 - 13:00 | 0 | 0 | 0 | 0 |
| 26.06.2023 13:00 - 14:00 | 0 | 0 | 0 | 0 |
| 26.06.2023 14:00 - 15:00 | 0 | 0 | 0 | 0 |
| 26.06.2023 15:00 - 16:00 | 0 | 0 | 0 | 0 |
| 26.06.2023 16:00 - 17:00 | 0 | 0 | 0 | 0 |
| 26.06.2023 17:00 - 18:00 | 0 | 0 | 0 | 0 |
| 26.06.2023 18:00 - 19:00 | 0 | 0 | 0 | 0 |
| 26.06.2023 19:00 - 20:00 | 0 | 0 | 0 | 0 |
| 26.06.2023 20:00 - 21:00 | 0 | 0 | 0 | 0 |
| 26.06.2023 21:00 - 22:00 | 0 | 0 | 0 | 0 |
| 26.06.2023 22:00 - 23:00 | 0 | 0 | 0 | 0 |
| 26.06.2023 23:00 - 24:00 | 0 | 0 | 0 | 0 |
| 27.06.2023 00:00 - 01:00 | 0 | 0 | 0 | 0 |
| 27.06.2023 01:00 - 02:00 | 0 | 0 | 0 | 0 |
| 27.06.2023 02:00 - 03:00 | 0 | 0 | 0 | 0 |
| 27.06.2023 03:00 - 04:00 | 0 | 0 | 0 | 0 |
| 27.06.2023 04:00 - 05:00 | 0 | 0 | 0 | 0 |
| 27.06.2023 05:00 - 06:00 | 0 | 0 | 0 | 0 |
| 27.06.2023 06:00 - 07:00 | 0 | 0 | 0 | 0 |
| 27.06.2023 07:00 - 08:00 | 0 | 0 | 0 | 0 |
| 27.06.2023 08:00 - 09:00 | 0 | 0 | 0 | 0 |
| 27.06.2023 09:00 - 10:00 | 0 | 0 | 0 | 0 |
| 27.06.2023 10:00 - 11:00 | 0 | 0 | 0 | 0 |
| 27.06.2023 11:00 - 12:00 | 0 | 0 | 0 | 0 |
| 27.06.2023 12:00 - 13:00 | 0 | 0 | 0 | 0 |
| 27.06.2023 13:00 - 14:00 | 20 | 0 | 0 | 0 |
| 27.06.2023 14:00 - 15:00 | 20 | 0 | 0 | 0 |
| 27.06.2023 15:00 - 16:00 | 20 | 0 | 0 | 0 |
| 27.06.2023 16:00 - 17:00 | 20 | 0 | 0 | 0 |
| 27.06.2023 17:00 - 18:00 | 20 | 0 | 0 | 0 |
| 27.06.2023 18:00 - 19:00 | 20 | 0 | 0 | 0 |
| 27.06.2023 19:00 - 20:00 | 20 | 0 | 0 | 0 |
| 27.06.2023 20:00 - 21:00 | 20 | 0 | 0 | 0 |
| 27.06.2023 21:00 - 22:00 | 20 | 0 | 0 | 0 |
| 27.06.2023 22:00 - 23:00 | 20 | 0 | 0 | 0 |
| 27.06.2023 23:00 - 24:00 | 20 | 0 | 0 | 0 |
| 28.06.2023 00:00 - 01:00 | 20 | 0 | 0 | 0 |
| 28.06.2023 01:00 - 02:00 | 20 | 0 | 0 | 0 |
| 28.06.2023 02:00 - 03:00 | 20 | 0 | 0 | 0 |
| 28.06.2023 03:00 - 04:00 | 20 | 0 | 0 | 0 |
| 28.06.2023 04:00 - 05:00 | 20 | 0 | 0 | 0 |
| 28.06.2023 05:00 - 06:00 | 20 | 0 | 0 | 0 |
| 28.06.2023 06:00 - 07:00 | 0 | 0 | 0 | 0 |
| 28.06.2023 07:00 - 08:00 | 0 | 0 | 0 | 0 |
| 28.06.2023 08:00 - 09:00 | 0 | 0 | 0 | 0 |
| 28.06.2023 09:00 - 10:00 | 0 | 0 | 0 | 0 |
| 28.06.2023 10:00 - 11:00 | 0 | 0 | 0 | 0 |
| 28.06.2023 11:00 - 12:00 | 0 | 0 | 0 | 0 |
| 28.06.2023 12:00 - 13:00 | 0 | 0 | 0 | 0 |
| 28.06.2023 13:00 - 14:00 | 0 | 0 | 0 | 0 |
| 28.06.2023 14:00 - 15:00 | 0 | 0 | 0 | 0 |
| 28.06.2023 15:00 - 16:00 | 0 | 0 | 0 | 0 |
| 28.06.2023 16:00 - 17:00 | 0 | 0 | 0 | 0 |
| 28.06.2023 17:00 - 18:00 | 0 | 0 | 0 | 0 |
| 28.06.2023 18:00 - 19:00 | 0 | 0 | 0 | 0 |
| 28.06.2023 19:00 - 20:00 | 0 | 0 | 0 | 0 |
| 28.06.2023 20:00 - 21:00 | 0 | 0 | 0 | 0 |
| 28.06.2023 21:00 - 22:00 | 0 | 0 | 0 | 0 |
| 28.06.2023 22:00 - 23:00 | 0 | 0 | 0 | 0 |
| 28.06.2023 23:00 - 24:00 | 0 | 0 | 0 | 0 |
| 29.06.2023 00:00 - 01:00 | 0 | 0 | 0 | 0 |
| 29.06.2023 01:00 - 02:00 | 0 | 0 | 0 | 0 |
| 29.06.2023 02:00 - 03:00 | 50 | 0 | 0 | 0 |
| 29.06.2023 03:00 - 04:00 | 50 | 0 | 0 | 0 |
| 29.06.2023 04:00 - 05:00 | 50 | 0 | 0 | 0 |
| 29.06.2023 05:00 - 06:00 | 50 | 0 | 0 | 0 |
| 29.06.2023 06:00 - 07:00 | 0 | 0 | 0 | 0 |
| 29.06.2023 07:00 - 08:00 | 0 | 0 | 0 | 0 |
| 29.06.2023 08:00 - 09:00 | 0 | 0 | 0 | 0 |
| 29.06.2023 09:00 - 10:00 | 0 | 0 | 0 | 0 |
| 29.06.2023 10:00 - 11:00 | 0 | 0 | 0 | 0 |
| 29.06.2023 11:00 - 12:00 | 0 | 0 | 0 | 0 |
| 29.06.2023 12:00 - 13:00 | 0 | 0 | 0 | 0 |
| 29.06.2023 13:00 - 14:00 | 0 | 0 | 0 | 0 |
| 29.06.2023 14:00 - 15:00 | 0 | 0 | 0 | 0 |
| 29.06.2023 15:00 - 16:00 | 0 | 0 | 0 | 0 |
| 29.06.2023 16:00 - 17:00 | 0 | 0 | 0 | 0 |
| 29.06.2023 17:00 - 18:00 | 0 | 0 | 0 | 0 |
| 29.06.2023 18:00 - 19:00 | 0 | 0 | 0 | 0 |
| 29.06.2023 19:00 - 20:00 | 30 | 0 | 0 | 0 |
| 29.06.2023 20:00 - 21:00 | 30 | 0 | 0 | 0 |
| 29.06.2023 21:00 - 22:00 | 30 | 0 | 0 | 0 |
| 29.06.2023 22:00 - 23:00 | 30 | 0 | 0 | 0 |
| 29.06.2023 23:00 - 24:00 | 30 | 0 | 0 | 0 |
| 30.06.2023 00:00 - 01:00 | 30 | 0 | 0 | 0 |
| 30.06.2023 01:00 - 02:00 | 30 | 0 | 0 | 0 |
| 30.06.2023 02:00 - 03:00 | 30 | 0 | 0 | 0 |
| 30.06.2023 03:00 - 04:00 | 30 | 0 | 0 | 0 |
| 30.06.2023 04:00 - 05:00 | 30 | 0 | 0 | 0 |
| 30.06.2023 05:00 - 06:00 | 30 | 0 | 0 | 0 |
| 30.06.2023 06:00 - 07:00 | 0 | 0 | 0 | 0 |
| 30.06.2023 07:00 - 08:00 | 0 | 0 | 0 | 0 |
| 30.06.2023 08:00 - 09:00 | 0 | 0 | 0 | 0 |
| 30.06.2023 09:00 - 10:00 | 0 | 0 | 0 | 0 |
| 30.06.2023 10:00 - 11:00 | 0 | 0 | 0 | 0 |
| 30.06.2023 11:00 - 12:00 | 0 | 0 | 0 | 0 |
| 30.06.2023 12:00 - 13:00 | 0 | 0 | 0 | 0 |
| 30.06.2023 13:00 - 14:00 | 0 | 0 | 0 | 0 |
| 30.06.2023 14:00 - 15:00 | 0 | 0 | 0 | 0 |
| 30.06.2023 15:00 - 16:00 | 0 | 0 | 0 | 0 |
| 30.06.2023 16:00 - 17:00 | 0 | 0 | 0 | 0 |
| 30.06.2023 17:00 - 18:00 | 0 | 0 | 0 | 0 |
| 30.06.2023 18:00 - 19:00 | 0 | 0 | 0 | 0 |
| 30.06.2023 19:00 - 20:00 | 0 | 0 | 0 | 0 |
| 30.06.2023 20:00 - 21:00 | 0 | 0 | 0 | 0 |
| 30.06.2023 21:00 - 22:00 | 0 | 0 | 0 | 0 |
| 30.06.2023 22:00 - 23:00 | 0 | 0 | 0 | 0 |
| 30.06.2023 23:00 - 24:00 | 0 | 0 | 0 | 0 |
| 01.07.2023 00:00 - 01:00 | 0 | 0 | 0 | 0 |
| 01.07.2023 01:00 - 02:00 | 0 | 0 | 0 | 0 |
| 01.07.2023 02:00 - 03:00 | 0 | 0 | 0 | 0 |
| 01.07.2023 03:00 - 04:00 | 0 | 0 | 0 | 0 |
| 01.07.2023 04:00 - 05:00 | 0 | 0 | 0 | 0 |
| 01.07.2023 05:00 - 06:00 | 0 | 0 | 0 | 0 |